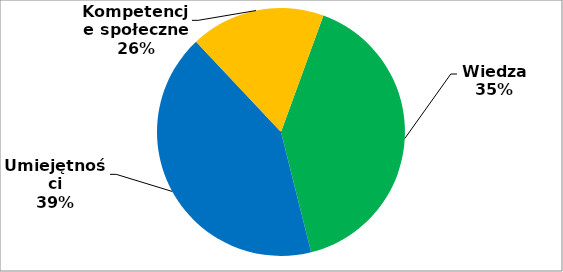
| Category | Series 0 |
|---|---|
| 0 | 30 |
| 1 | 31 |
| 2 | 13 |